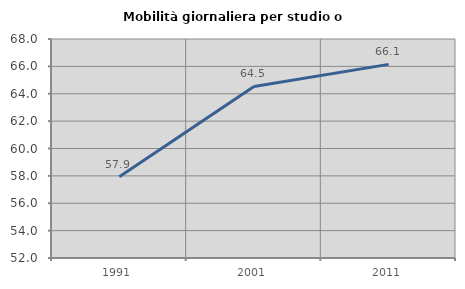
| Category | Mobilità giornaliera per studio o lavoro |
|---|---|
| 1991.0 | 57.932 |
| 2001.0 | 64.531 |
| 2011.0 | 66.147 |